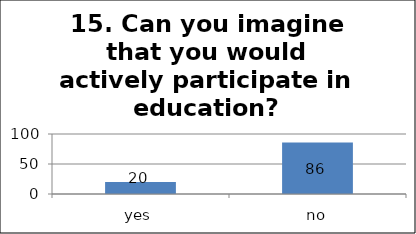
| Category | Series 0 |
|---|---|
| yes | 20 |
| no | 86 |